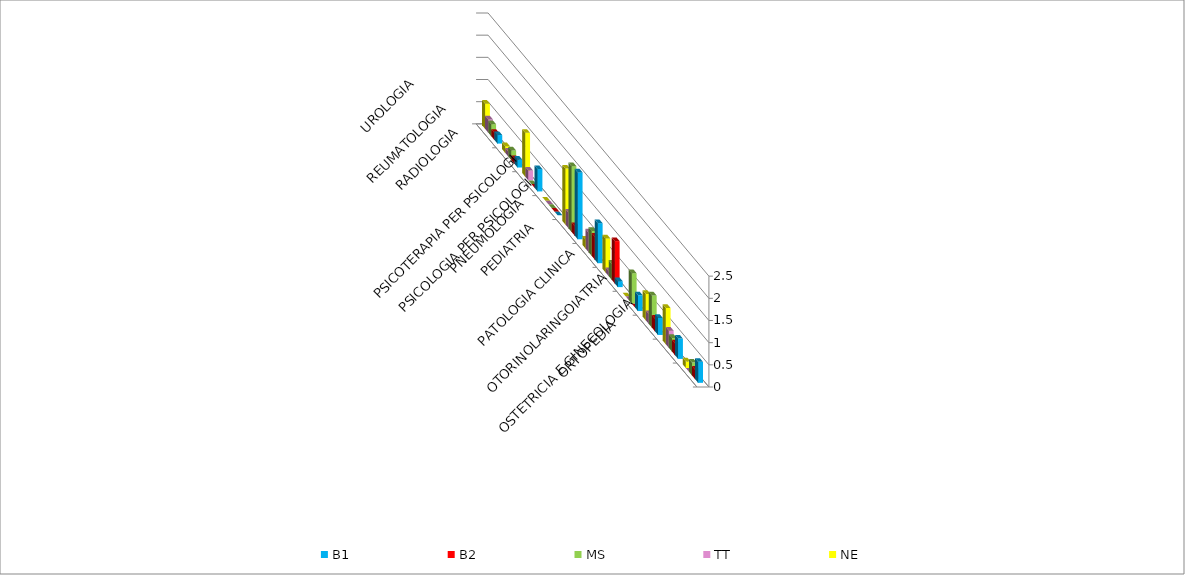
| Category | B1 | B2 | MS | TT | NE |
|---|---|---|---|---|---|
| ORTOPEDIA | 0.473 | 0.212 | 0.289 | 0 | 0.148 |
| OSTETRICIA E GINECOLOGIA | 0.458 | 0.265 | 0.307 | 0.387 | 0.816 |
| OTORINOLARINGOIATRIA | 0.384 | 0.283 | 0.724 | 0.221 | 0.594 |
| PATOLOGIA CLINICA | 0.355 | 0 | 0.687 | 0 | 0 |
| PEDIATRIA | 0.133 | 0.955 | 0.362 | 0.111 | 0.767 |
| PNEUMOLOGIA | 0.902 | 0.513 | 0.561 | 0.443 | 0.198 |
| PSICOLOGIA PER PSICOLOGI | 1.508 | 0.212 | 1.483 | 0.35 | 1.262 |
| PSICOTERAPIA PER PSICOLOGI | 0 | 0 | 0 | 0 | 0 |
| RADIOLOGIA | 0.503 | 0 | 0 | 0.221 | 0.99 |
| REUMATOLOGIA | 0.177 | 0.106 | 0.217 | 0.111 | 0.148 |
| UROLOGIA | 0.192 | 0.159 | 0.271 | 0.295 | 0.569 |